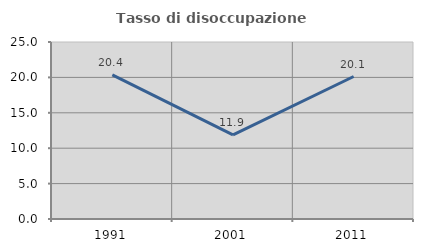
| Category | Tasso di disoccupazione giovanile  |
|---|---|
| 1991.0 | 20.368 |
| 2001.0 | 11.885 |
| 2011.0 | 20.124 |